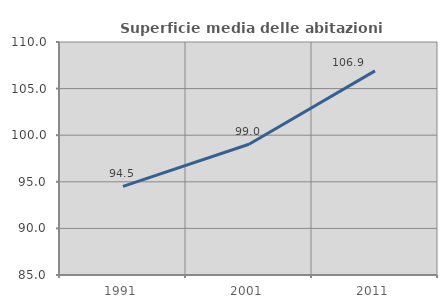
| Category | Superficie media delle abitazioni occupate |
|---|---|
| 1991.0 | 94.517 |
| 2001.0 | 99.03 |
| 2011.0 | 106.904 |